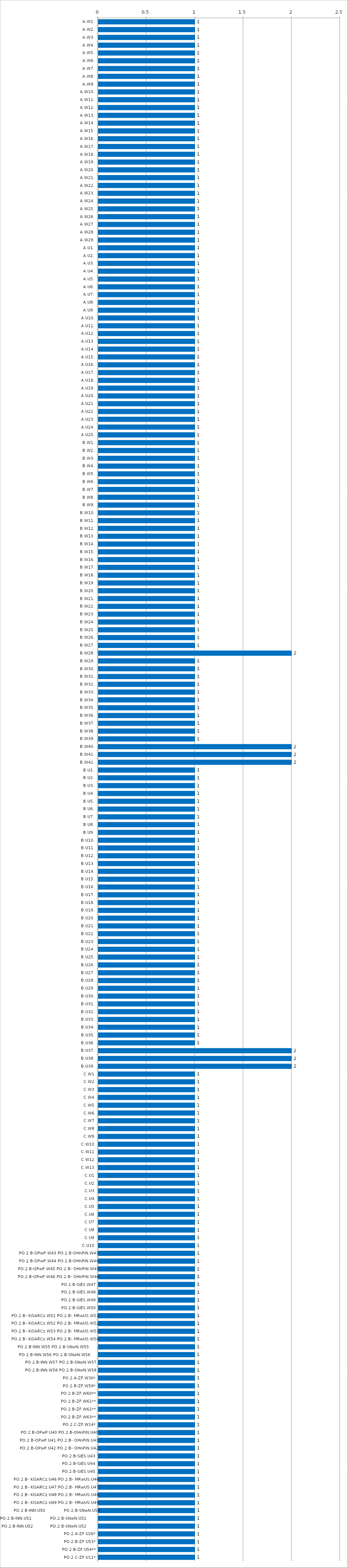
| Category | Series 0 |
|---|---|
| A.W1. | 1 |
| A.W2. | 1 |
| A.W3. | 1 |
| A.W4. | 1 |
| A.W5. | 1 |
| A.W6. | 1 |
| A.W7. | 1 |
| A.W8. | 1 |
| A.W9. | 1 |
| A.W10. | 1 |
| A.W11. | 1 |
| A.W12. | 1 |
| A.W13. | 1 |
| A.W14. | 1 |
| A.W15. | 1 |
| A.W16. | 1 |
| A.W17. | 1 |
| A.W18. | 1 |
| A.W19. | 1 |
| A.W20. | 1 |
| A.W21. | 1 |
| A.W22. | 1 |
| A.W23. | 1 |
| A.W24. | 1 |
| A.W25. | 1 |
| A.W26. | 1 |
| A.W27. | 1 |
| A.W28. | 1 |
| A.W29. | 1 |
| A.U1. | 1 |
| A.U2. | 1 |
| A.U3. | 1 |
| A.U4. | 1 |
| A.U5. | 1 |
| A.U6. | 1 |
| A.U7. | 1 |
| A.U8. | 1 |
| A.U9. | 1 |
| A.U10. | 1 |
| A.U11. | 1 |
| A.U12. | 1 |
| A.U13. | 1 |
| A.U14. | 1 |
| A.U15. | 1 |
| A.U16. | 1 |
| A.U17. | 1 |
| A.U18. | 1 |
| A.U19. | 1 |
| A.U20. | 1 |
| A.U21. | 1 |
| A.U22. | 1 |
| A.U23. | 1 |
| A.U24. | 1 |
| A.U25. | 1 |
| B.W1. | 1 |
| B.W2. | 1 |
| B.W3. | 1 |
| B.W4. | 1 |
| B.W5. | 1 |
| B.W6. | 1 |
| B.W7. | 1 |
| B.W8. | 1 |
| B.W9. | 1 |
| B.W10. | 1 |
| B.W11. | 1 |
| B.W12. | 1 |
| B.W13. | 1 |
| B.W14. | 1 |
| B.W15. | 1 |
| B.W16. | 1 |
| B.W17. | 1 |
| B.W18. | 1 |
| B.W19. | 1 |
| B.W20. | 1 |
| B.W21. | 1 |
| B.W22. | 1 |
| B.W23. | 1 |
| B.W24. | 1 |
| B.W25. | 1 |
| B.W26. | 1 |
| B.W27. | 1 |
| B.W28. | 2 |
| B.W29. | 1 |
| B.W30. | 1 |
| B.W31. | 1 |
| B.W32. | 1 |
| B.W33. | 1 |
| B.W34. | 1 |
| B.W35. | 1 |
| B.W36. | 1 |
| B.W37. | 1 |
| B.W38. | 1 |
| B.W39. | 1 |
| B.W40. | 2 |
| B.W41. | 2 |
| B.W42. | 2 |
| B.U1. | 1 |
| B.U2. | 1 |
| B.U3. | 1 |
| B.U4. | 1 |
| B.U5. | 1 |
| B.U6. | 1 |
| B.U7. | 1 |
| B.U8. | 1 |
| B.U9. | 1 |
| B.U10. | 1 |
| B.U11. | 1 |
| B.U12. | 1 |
| B.U13. | 1 |
| B.U14. | 1 |
| B.U15. | 1 |
| B.U16. | 1 |
| B.U17. | 1 |
| B.U18. | 1 |
| B.U19. | 1 |
| B.U20. | 1 |
| B.U21. | 1 |
| B.U22. | 1 |
| B.U23. | 1 |
| B.U24. | 1 |
| B.U25. | 1 |
| B.U26. | 1 |
| B.U27. | 1 |
| B.U28. | 1 |
| B.U29. | 1 |
| B.U30. | 1 |
| B.U31. | 1 |
| B.U32. | 1 |
| B.U33. | 1 |
| B.U34. | 1 |
| B.U35. | 1 |
| B.U36. | 1 |
| B.U37. | 2 |
| B.U38. | 2 |
| B.U39. | 2 |
| C.W1 | 1 |
| C.W2 | 1 |
| C.W3 | 1 |
| C.W4 | 1 |
| C.W5 | 1 |
| C.W6 | 1 |
| C.W7 | 1 |
| C.W8 | 1 |
| C.W9 | 1 |
| C.W10 | 1 |
| C.W11 | 1 |
| C.W12 | 1 |
| C.W13 | 1 |
| C.U1 | 1 |
| C.U2 | 1 |
| C.U3 | 1 |
| C.U4 | 1 |
| C.U5 | 1 |
| C.U6 | 1 |
| C.U7 | 1 |
| C.U8 | 1 |
| C.U9 | 1 |
| C.U10 | 1 |
| PO.2.B-OPwP.W43 PO.2.B-OHnPiN.W43 | 1 |
| PO.2.B-OPwP.W44 PO.2.B-OHnPiN.W44 | 1 |
| PO.2.B-OPwP.W45 PO.2.B- OHnPiN.W45 | 1 |
| PO.2.B-OPwP.W46 PO.2.B- OHnPiN.W46 | 1 |
| PO.2.B-SiES.W47 | 1 |
| PO.2.B-SiES.W48 | 1 |
| PO.2.B-SiES.W49 | 1 |
| PO.2.B-SiES.W50 | 1 |
| PO.2.B- KiSARCz.W51 PO.2.B- MRwUS.W51 | 1 |
| PO.2.B- KiSARCz.W52 PO.2.B- MRwUS.W52 | 1 |
| PO.2.B- KiSARCz.W53 PO.2.B- MRwUS.W53 | 1 |
| PO.2.B- KiSARCz.W54 PO.2.B- MRwUS.W54 | 1 |
| PO.2.B-INN.W55 PO.2.B-SNwN.W55        | 1 |
| PO.2.B-INN.W56 PO.2.B-SNwN.W56       | 1 |
| PO.2.B-INN.W57 PO.2.B-SNwN.W57  | 1 |
| PO.2.B-INN.W58 PO.2.B-SNwN.W58  | 1 |
| PO.2.A-ZF.W30* | 1 |
| PO.2.B-ZF.W59* | 1 |
| PO.2.B-ZF.W60** | 1 |
| PO.2.B-ZF.W61** | 1 |
| PO.2.B-ZF.W62** | 1 |
| PO.2.B-ZF.W63** | 1 |
| PO.2.C-ZF.W14* | 1 |
| PO.2.B-OPwP.U40 PO.2.B-OHnPiN.U40 | 1 |
| PO.2.B-OPwP.U41 PO.2.B- OHnPiN.U41 | 1 |
| PO.2.B-OPwP.U42 PO.2.B- OHnPiN.U42 | 1 |
| PO.2.B-SiES.U43 | 1 |
| PO.2.B-SiES.U44 | 1 |
| PO.2.B-SiES.U45 | 1 |
| PO.2.B- KiSARCz.U46 PO.2.B- MRwUS.U46 | 1 |
| PO.2.B- KiSARCz.U47 PO.2.B- MRwUS.U47 | 1 |
| PO.2.B- KiSARCz.U48 PO.2.B- MRwUS.U48 | 1 |
| PO.2.B- KiSARCz.U49 PO.2.B- MRwUS.U49 | 1 |
| PO.2.B-INN.U50             PO.2.B-SNwN.U50 | 1 |
| PO.2.B-INN.U51             PO.2.B-SNwN.U51            | 1 |
| PO.2.B-INN.U52            PO.2.B-SNwN.U52            | 1 |
| PO.2.A-ZF.U26* | 1 |
| PO.2.B-ZF.U53* | 1 |
| PO.2.B-ZF.U54** | 1 |
| PO.2.C-ZF.U11* | 1 |